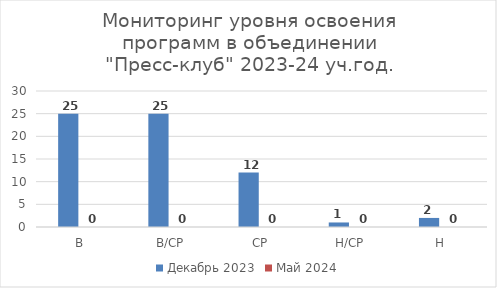
| Category | Декабрь 2023 | Май 2024 |
|---|---|---|
| В | 25 | 0 |
| В/СР | 25 | 0 |
| СР | 12 | 0 |
| Н/СР | 1 | 0 |
| Н | 2 | 0 |